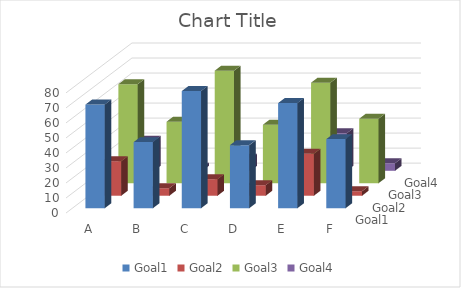
| Category | Goal1 | Goal2 | Goal3 | Goal4 |
|---|---|---|---|---|
| A | 69 | 23 | 66 | 20 |
| B | 44 | 5 | 41 | 2 |
| C | 78 | 11 | 75 | 8 |
| D | 42 | 7 | 39 | 4 |
| E | 70 | 28 | 67 | 25 |
| F | 46 | 3 | 43 | 5 |